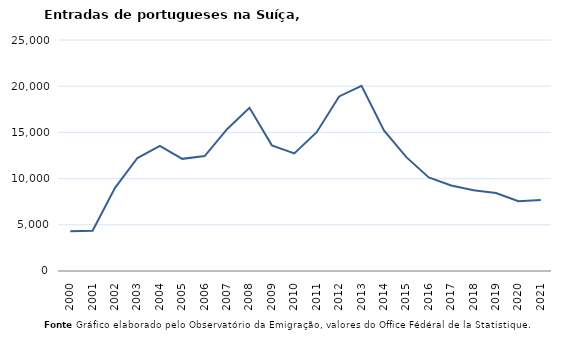
| Category | Entradas |
|---|---|
| 2000.0 | 4311 |
| 2001.0 | 4347 |
| 2002.0 | 9005 |
| 2003.0 | 12228 |
| 2004.0 | 13539 |
| 2005.0 | 12138 |
| 2006.0 | 12441 |
| 2007.0 | 15351 |
| 2008.0 | 17657 |
| 2009.0 | 13601 |
| 2010.0 | 12720 |
| 2011.0 | 15020 |
| 2012.0 | 18892 |
| 2013.0 | 20039 |
| 2014.0 | 15221 |
| 2015.0 | 12325 |
| 2016.0 | 10123 |
| 2017.0 | 9257 |
| 2018.0 | 8733 |
| 2019.0 | 8443 |
| 2020.0 | 7542 |
| 2021.0 | 7675 |